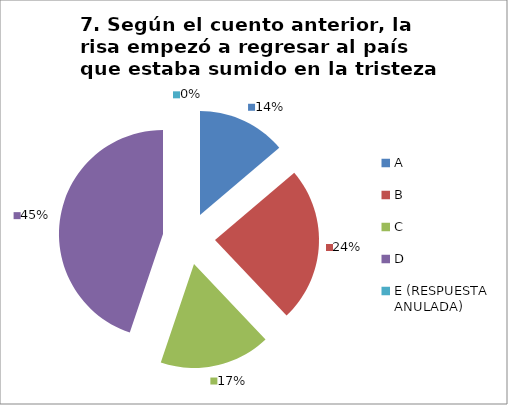
| Category | CANTIDAD DE RESPUESTAS PREGUNTA (7) | PORCENTAJE |
|---|---|---|
| A | 4 | 0.138 |
| B | 7 | 0.241 |
| C | 5 | 0.172 |
| D | 13 | 0.448 |
| E (RESPUESTA ANULADA) | 0 | 0 |